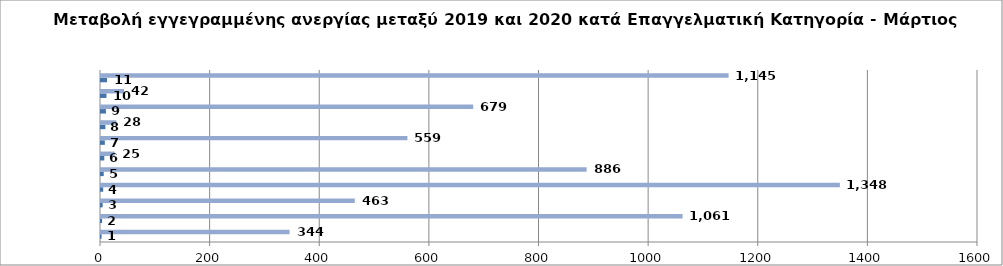
| Category | Series 0 | Series 1 |
|---|---|---|
| 0 | 1 | 344 |
| 1 | 2 | 1061 |
| 2 | 3 | 463 |
| 3 | 4 | 1348 |
| 4 | 5 | 886 |
| 5 | 6 | 25 |
| 6 | 7 | 559 |
| 7 | 8 | 28 |
| 8 | 9 | 679 |
| 9 | 10 | 42 |
| 10 | 11 | 1145 |